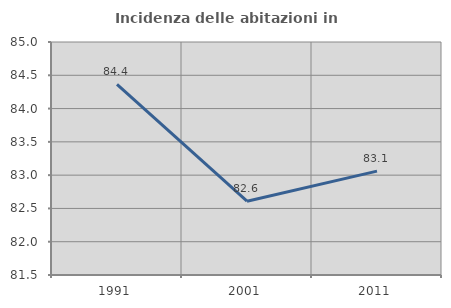
| Category | Incidenza delle abitazioni in proprietà  |
|---|---|
| 1991.0 | 84.362 |
| 2001.0 | 82.609 |
| 2011.0 | 83.06 |